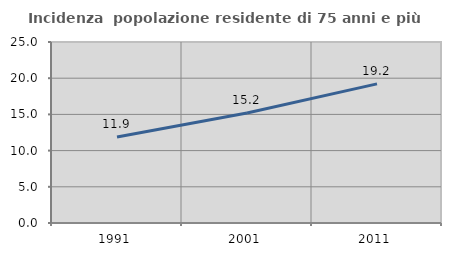
| Category | Incidenza  popolazione residente di 75 anni e più |
|---|---|
| 1991.0 | 11.877 |
| 2001.0 | 15.185 |
| 2011.0 | 19.218 |